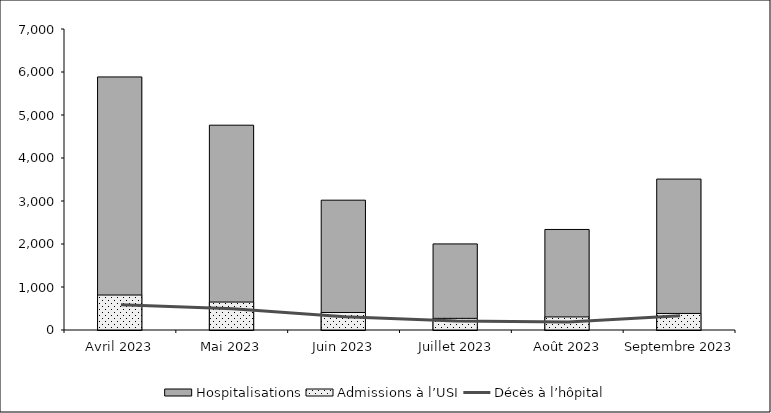
| Category | Hospitalisations | Admissions à l’USI |
|---|---|---|
| Avril 2023 | 5885 | 813 |
| Mai 2023 | 4763 | 650 |
| Juin 2023 | 3019 | 407 |
| Juillet 2023 | 2002 | 271 |
| Août 2023 | 2338 | 304 |
| Septembre 2023 | 3510 | 385 |